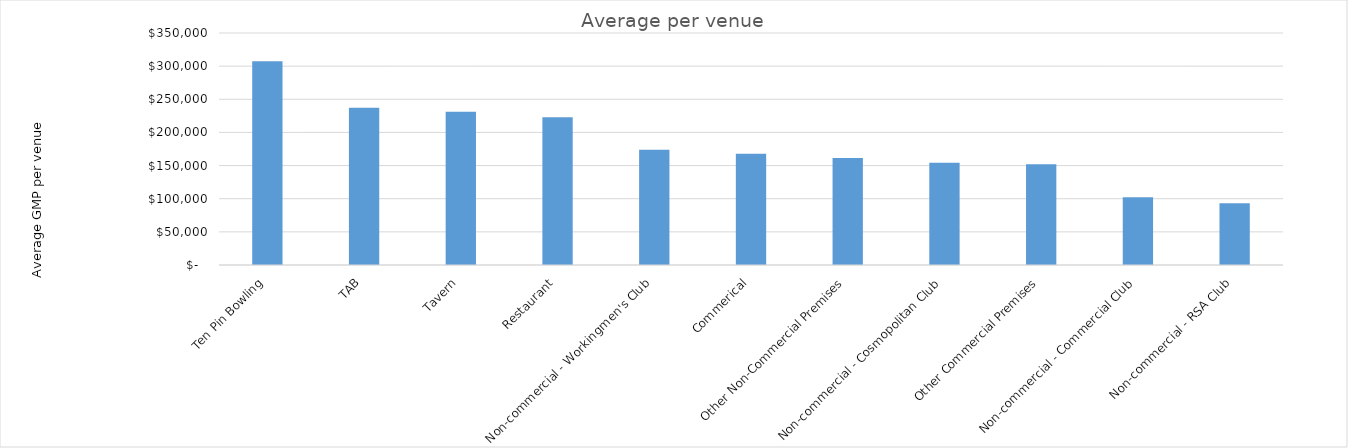
| Category | Average per venue |
|---|---|
| Ten Pin Bowling | 307445.422 |
| TAB | 237353.018 |
| Tavern | 231313.268 |
| Restaurant | 223073.924 |
| Non-commercial - Workingmen's Club | 173776.428 |
| Commerical | 167736.765 |
| Other Non-Commercial Premises | 161385.018 |
| Non-commercial - Cosmopolitan Club | 154156.192 |
| Other Commercial Premises | 151883.719 |
| Non-commercial - Commercial Club | 102222.037 |
| Non-commercial - RSA Club | 93241.239 |